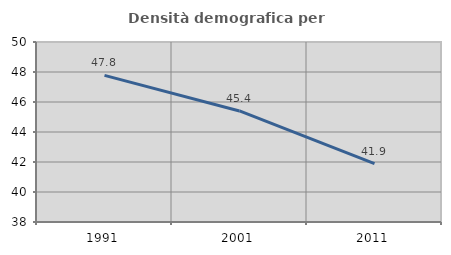
| Category | Densità demografica |
|---|---|
| 1991.0 | 47.776 |
| 2001.0 | 45.403 |
| 2011.0 | 41.894 |